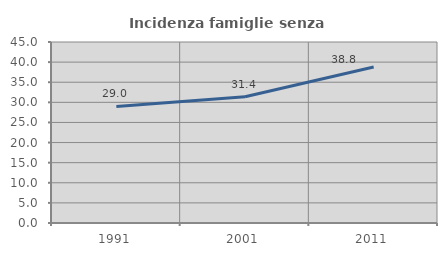
| Category | Incidenza famiglie senza nuclei |
|---|---|
| 1991.0 | 28.976 |
| 2001.0 | 31.386 |
| 2011.0 | 38.804 |